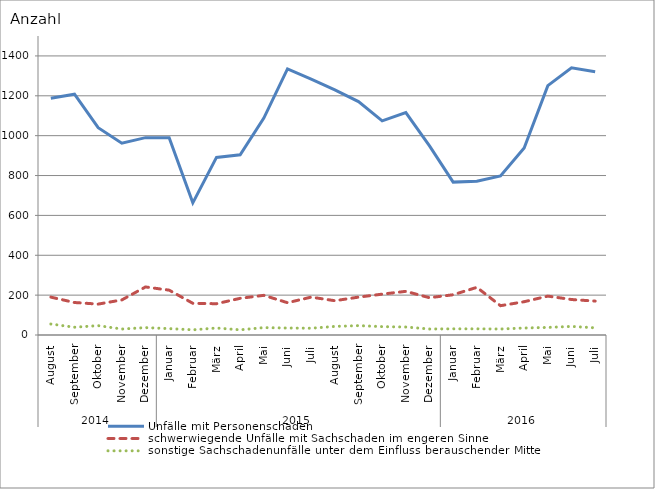
| Category | Unfälle mit Personenschaden | schwerwiegende Unfälle mit Sachschaden im engeren Sinne | sonstige Sachschadenunfälle unter dem Einfluss berauschender Mittel |
|---|---|---|---|
| 0 | 1188 | 190 | 55 |
| 1 | 1208 | 163 | 39 |
| 2 | 1040 | 155 | 47 |
| 3 | 962 | 176 | 30 |
| 4 | 990 | 241 | 37 |
| 5 | 990 | 225 | 32 |
| 6 | 663 | 159 | 26 |
| 7 | 891 | 157 | 35 |
| 8 | 904 | 184 | 26 |
| 9 | 1088 | 199 | 37 |
| 10 | 1335 | 162 | 35 |
| 11 | 1284 | 190 | 34 |
| 12 | 1230 | 172 | 43 |
| 13 | 1171 | 190 | 47 |
| 14 | 1074 | 205 | 42 |
| 15 | 1116 | 219 | 40 |
| 16 | 949 | 187 | 30 |
| 17 | 767 | 202 | 31 |
| 18 | 771 | 239 | 31 |
| 19 | 798 | 147 | 30 |
| 20 | 938 | 167 | 35 |
| 21 | 1251 | 195 | 38 |
| 22 | 1340 | 178 | 43 |
| 23 | 1321 | 170 | 36 |